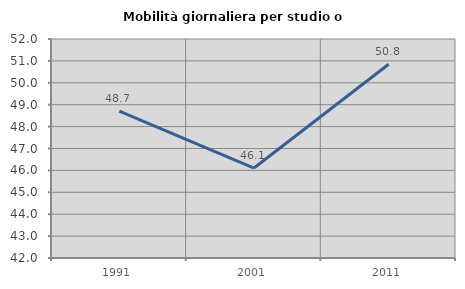
| Category | Mobilità giornaliera per studio o lavoro |
|---|---|
| 1991.0 | 48.703 |
| 2001.0 | 46.108 |
| 2011.0 | 50.844 |